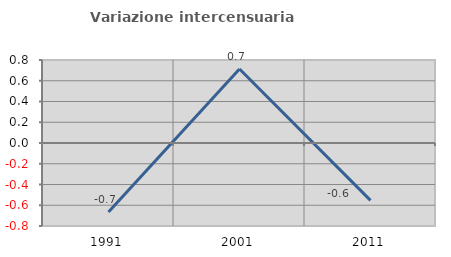
| Category | Variazione intercensuaria annua |
|---|---|
| 1991.0 | -0.665 |
| 2001.0 | 0.713 |
| 2011.0 | -0.553 |